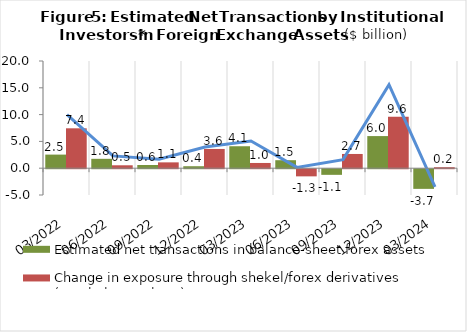
| Category | Estimated net transactions in balance-sheet forex assets | Change in exposure through shekel/forex derivatives (non-balance-sheet) |
|---|---|---|
| 2022-03-31 | 2.537 | 7.444 |
| 2022-06-30 | 1.751 | 0.543 |
| 2022-09-30 | 0.595 | 1.089 |
| 2022-12-31 | 0.369 | 3.592 |
| 2023-03-31 | 4.097 | 0.976 |
| 2023-06-30 | 1.493 | -1.335 |
| 2023-09-30 | -1.052 | 2.656 |
| 2023-12-31 | 5.992 | 9.584 |
| 2024-03-31 | -3.67 | 0.189 |